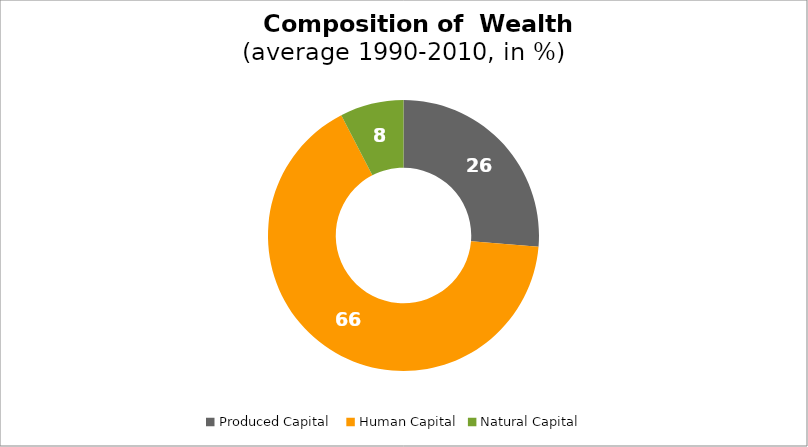
| Category | Series 0 |
|---|---|
| Produced Capital  | 26.334 |
| Human Capital | 66.071 |
| Natural Capital | 7.595 |